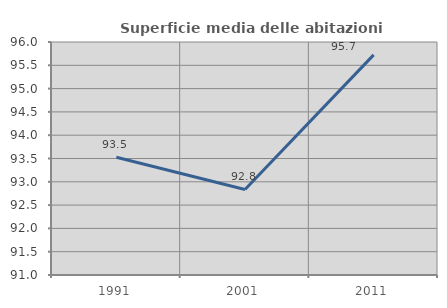
| Category | Superficie media delle abitazioni occupate |
|---|---|
| 1991.0 | 93.525 |
| 2001.0 | 92.836 |
| 2011.0 | 95.724 |